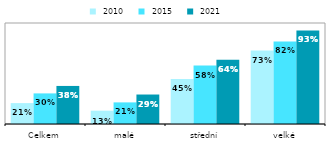
| Category |  2010 |  2015 |  2021 |
|---|---|---|---|
| Celkem | 0.207 | 0.303 | 0.377 |
| malé | 0.132 | 0.214 | 0.292 |
| střední | 0.446 | 0.578 | 0.637 |
| velké | 0.727 | 0.818 | 0.927 |